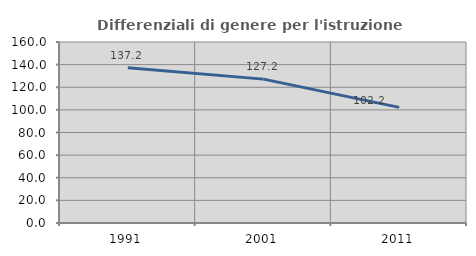
| Category | Differenziali di genere per l'istruzione superiore |
|---|---|
| 1991.0 | 137.207 |
| 2001.0 | 127.179 |
| 2011.0 | 102.236 |